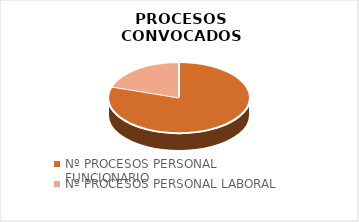
| Category | Series 0 |
|---|---|
| Nº PROCESOS PERSONAL FUNCIONARIO | 48 |
| Nº PROCESOS PERSONAL LABORAL | 12 |